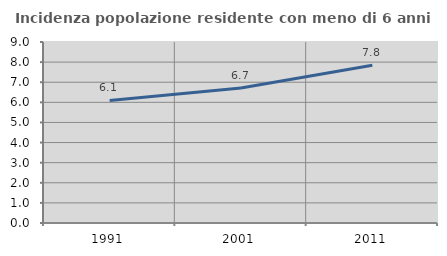
| Category | Incidenza popolazione residente con meno di 6 anni |
|---|---|
| 1991.0 | 6.094 |
| 2001.0 | 6.712 |
| 2011.0 | 7.848 |